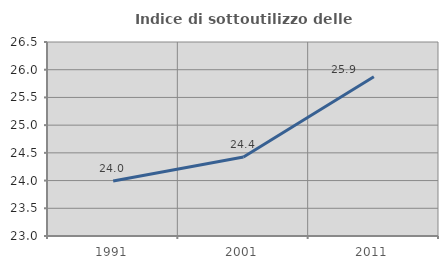
| Category | Indice di sottoutilizzo delle abitazioni  |
|---|---|
| 1991.0 | 23.993 |
| 2001.0 | 24.426 |
| 2011.0 | 25.875 |